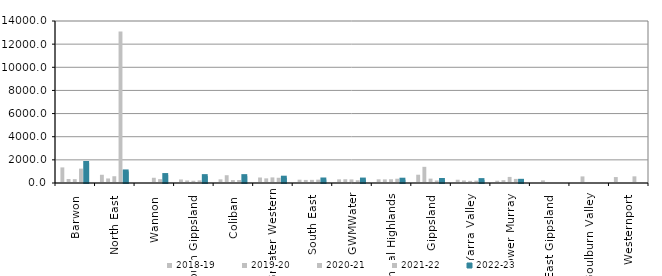
| Category | 2018-19 | 2019-20 | 2020-21 | 2021-22 | 2022-23 |
|---|---|---|---|---|---|
| Barwon  | 1347.945 | 345.083 | 334.826 | 1242.6 | 1728.722 |
| North East  | 712 | 392.5 | 583.25 | 13095 | 998.667 |
| Wannon  | 0 | 0 | 452 | 331.5 | 686.333 |
| South Gippsland  | 305.667 | 221.684 | 196.137 | 230.574 | 594.08 |
| Coliban  | 314.824 | 672.278 | 253.429 | 261.095 | 592.864 |
| Greater Western | 475.051 | 401.994 | 483.884 | 451.467 | 458.503 |
| South East  | 284.41 | 266.36 | 270.865 | 289.01 | 302.542 |
| GWMWater | 315.294 | 324.871 | 310.133 | 241.673 | 296.493 |
| Central Highlands  | 318.077 | 313.271 | 323.513 | 370.114 | 284 |
| Gippsland  | 716.228 | 1397.562 | 377.339 | 218.181 | 259.767 |
| Yarra Valley  | 282.741 | 221.621 | 185.238 | 204.4 | 249.87 |
| Lower Murray  | 198.3 | 245.333 | 524.667 | 354.667 | 189 |
| East Gippsland  | 0 | 227.667 | 0 | 0 | 0 |
| Goulburn Valley  | 0 | 571 | 0 | 0 | 0 |
| Westernport  | 514 | 0 | 0 | 576 | 0 |